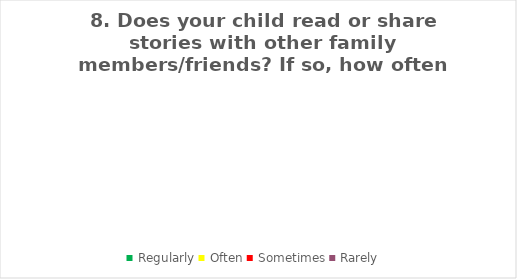
| Category | Series 0 |
|---|---|
| Regularly | 0 |
| Often | 0 |
| Sometimes | 0 |
| Rarely | 0 |